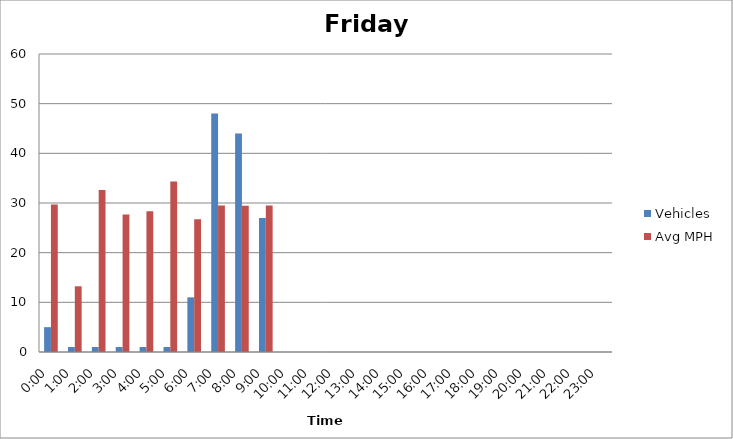
| Category | Vehicles | Avg MPH |
|---|---|---|
| 0:00 | 5 | 29.69 |
| 1:00 | 1 | 13.23 |
| 2:00 | 1 | 32.61 |
| 3:00 | 1 | 27.67 |
| 4:00 | 1 | 28.35 |
| 5:00 | 1 | 34.33 |
| 6:00 | 11 | 26.72 |
| 7:00 | 48 | 29.5 |
| 8:00 | 44 | 29.47 |
| 9:00 | 27 | 29.51 |
| 10:00 | 0 | 0 |
| 11:00 | 0 | 0 |
| 12:00 | 0 | 0 |
| 13:00 | 0 | 0 |
| 14:00 | 0 | 0 |
| 15:00 | 0 | 0 |
| 16:00 | 0 | 0 |
| 17:00 | 0 | 0 |
| 18:00 | 0 | 0 |
| 19:00 | 0 | 0 |
| 20:00 | 0 | 0 |
| 21:00 | 0 | 0 |
| 22:00 | 0 | 0 |
| 23:00 | 0 | 0 |